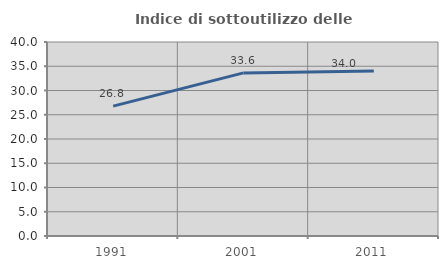
| Category | Indice di sottoutilizzo delle abitazioni  |
|---|---|
| 1991.0 | 26.776 |
| 2001.0 | 33.624 |
| 2011.0 | 34.034 |